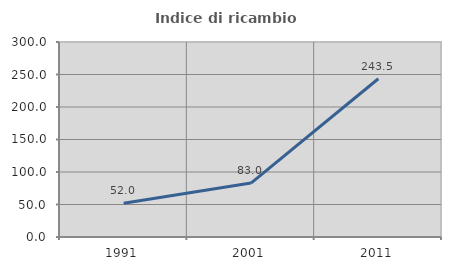
| Category | Indice di ricambio occupazionale  |
|---|---|
| 1991.0 | 52 |
| 2001.0 | 82.955 |
| 2011.0 | 243.478 |